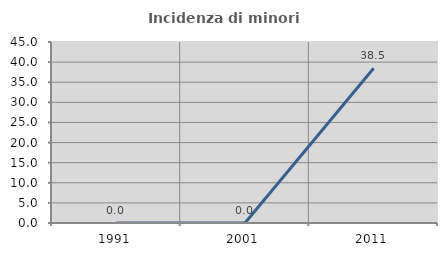
| Category | Incidenza di minori stranieri |
|---|---|
| 1991.0 | 0 |
| 2001.0 | 0 |
| 2011.0 | 38.462 |